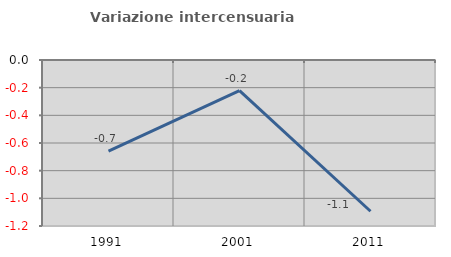
| Category | Variazione intercensuaria annua |
|---|---|
| 1991.0 | -0.658 |
| 2001.0 | -0.222 |
| 2011.0 | -1.093 |